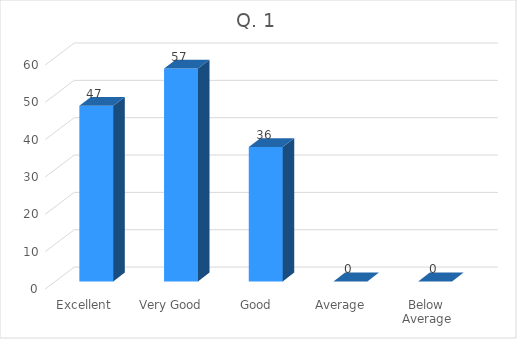
| Category | Series 0 |
|---|---|
| Excellent  | 47 |
| Very Good | 57 |
| Good | 36 |
| Average | 0 |
| Below Average | 0 |